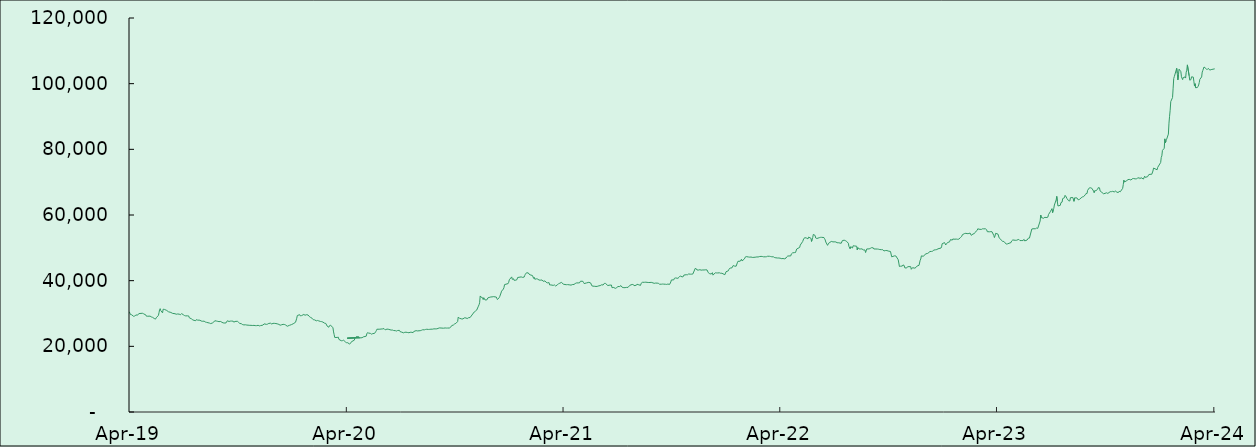
| Category | Series 0 |
|---|---|
| 2019-04-01 | 30527.5 |
| 2019-04-02 | 30226.77 |
| 2019-04-03 | 29668.73 |
| 2019-04-04 | 29553.12 |
| 2019-04-05 | 29616.38 |
| 2019-04-08 | 29162.24 |
| 2019-04-09 | 29158.736 |
| 2019-04-10 | 29193.42 |
| 2019-04-11 | 29347.62 |
| 2019-04-12 | 29560.47 |
| 2019-04-15 | 29495.91 |
| 2019-04-16 | 29746.24 |
| 2019-04-17 | 29970.86 |
| 2019-04-18 | 30086.31 |
| 2019-04-23 | 30076 |
| 2019-04-24 | 29898.31 |
| 2019-04-25 | 29919.44 |
| 2019-04-26 | 29740.41 |
| 2019-04-29 | 29521.06 |
| 2019-04-30 | 29159.74 |
| 2019-05-02 | 29171.73 |
| 2019-05-03 | 29212 |
| 2019-05-06 | 29196.87 |
| 2019-05-07 | 29096.41 |
| 2019-05-08 | 28966.41 |
| 2019-05-09 | 28896.25 |
| 2019-05-10 | 28847.81 |
| 2019-05-13 | 28484.44 |
| 2019-05-14 | 28422.76 |
| 2019-05-15 | 28286.08 |
| 2019-05-16 | 28438.19 |
| 2019-05-17 | 28871.93 |
| 2019-05-20 | 29374.47 |
| 2019-05-21 | 30218.14 |
| 2019-05-22 | 31145.15 |
| 2019-05-23 | 31477.51 |
| 2019-05-24 | 30881.29 |
| 2019-05-27 | 30194.71 |
| 2019-05-28 | 31307 |
| 2019-05-30 | 31254.19 |
| 2019-05-31 | 31069.37 |
| 2019-06-03 | 30930.39 |
| 2019-06-06 | 30527.07 |
| 2019-06-07 | 30432.13 |
| 2019-06-10 | 30322.19 |
| 2019-06-11 | 30099.83 |
| 2019-06-13 | 30029.15 |
| 2019-06-14 | 30046.7 |
| 2019-06-17 | 29936.33 |
| 2019-06-18 | 29818.8 |
| 2019-06-19 | 29772.72 |
| 2019-06-20 | 29765.31 |
| 2019-06-21 | 29851.29 |
| 2019-06-24 | 29809 |
| 2019-06-25 | 29668.68 |
| 2019-06-26 | 29609 |
| 2019-06-27 | 29749.35 |
| 2019-06-28 | 29966.87 |
| 2019-07-01 | 29614.61 |
| 2019-07-02 | 29395.14 |
| 2019-07-03 | 29375.25 |
| 2019-07-04 | 29300.09 |
| 2019-07-05 | 29270.95 |
| 2019-07-08 | 29287.87 |
| 2019-07-09 | 29318.85 |
| 2019-07-10 | 29256.6 |
| 2019-07-11 | 28712.9 |
| 2019-07-12 | 28566.79 |
| 2019-07-15 | 28341.03 |
| 2019-07-16 | 28200.88 |
| 2019-07-17 | 28042.8 |
| 2019-07-18 | 27864.49 |
| 2019-07-19 | 27919.5 |
| 2019-07-22 | 27808.69 |
| 2019-07-23 | 28144.87 |
| 2019-07-24 | 28088.74 |
| 2019-07-25 | 27990.61 |
| 2019-07-26 | 27918.59 |
| 2019-07-29 | 27950.36 |
| 2019-07-30 | 27820.57 |
| 2019-07-31 | 27718.26 |
| 2019-08-01 | 27748.46 |
| 2019-08-02 | 27630.46 |
| 2019-08-05 | 27672.29 |
| 2019-08-06 | 27527.4 |
| 2019-08-07 | 27412.13 |
| 2019-08-08 | 27424.92 |
| 2019-08-09 | 27306.81 |
| 2019-08-14 | 27083.11 |
| 2019-08-15 | 27052.93 |
| 2019-08-16 | 26925.29 |
| 2019-08-19 | 27115.89 |
| 2019-08-20 | 27058.62 |
| 2019-08-21 | 27352.94 |
| 2019-08-22 | 27629.66 |
| 2019-08-23 | 27800.17 |
| 2019-08-26 | 27691.85 |
| 2019-08-27 | 27602.77 |
| 2019-08-28 | 27607.02 |
| 2019-08-29 | 27425.57 |
| 2019-08-30 | 27525.81 |
| 2019-09-02 | 27565.09 |
| 2019-09-03 | 27586.79 |
| 2019-09-04 | 27319.64 |
| 2019-09-05 | 27273.14 |
| 2019-09-06 | 27146.57 |
| 2019-09-09 | 27089.84 |
| 2019-09-10 | 27047.58 |
| 2019-09-11 | 27153.53 |
| 2019-09-12 | 27426.64 |
| 2019-09-13 | 27779 |
| 2019-09-16 | 27574.32 |
| 2019-09-17 | 27407.04 |
| 2019-09-18 | 27681.61 |
| 2019-09-19 | 27646.15 |
| 2019-09-20 | 27698.69 |
| 2019-09-23 | 27657.27 |
| 2019-09-24 | 27352.24 |
| 2019-09-25 | 27283.05 |
| 2019-09-26 | 27579.85 |
| 2019-09-27 | 27675.04 |
| 2019-09-30 | 27630.56 |
| 2019-10-02 | 27314.87 |
| 2019-10-03 | 27085.69 |
| 2019-10-04 | 26987.45 |
| 2019-10-07 | 26866.41 |
| 2019-10-08 | 26809.92 |
| 2019-10-09 | 26598.94 |
| 2019-10-10 | 26583.75 |
| 2019-10-11 | 26533.78 |
| 2019-10-14 | 26557.44 |
| 2019-10-15 | 26513.65 |
| 2019-10-16 | 26472.2 |
| 2019-10-17 | 26456.29 |
| 2019-10-18 | 26448.62 |
| 2019-10-21 | 26390.08 |
| 2019-10-22 | 26365.83 |
| 2019-10-23 | 26397.94 |
| 2019-10-24 | 26357.24 |
| 2019-10-25 | 26348.73 |
| 2019-10-28 | 26384.45 |
| 2019-10-29 | 26244.39 |
| 2019-10-30 | 26310.77 |
| 2019-10-31 | 26355.35 |
| 2019-11-01 | 26293.3 |
| 2019-11-04 | 26401.06 |
| 2019-11-05 | 26375.35 |
| 2019-11-06 | 26223.66 |
| 2019-11-07 | 26188.24 |
| 2019-11-08 | 26314.49 |
| 2019-11-12 | 26456.39 |
| 2019-11-13 | 26339.11 |
| 2019-11-14 | 26843.11 |
| 2019-11-15 | 26851.68 |
| 2019-11-18 | 26691.09 |
| 2019-11-19 | 26739.52 |
| 2019-11-20 | 26776.15 |
| 2019-11-21 | 26872.09 |
| 2019-11-22 | 26991.42 |
| 2019-11-25 | 27035.78 |
| 2019-11-26 | 26883.33 |
| 2019-11-27 | 26790.1 |
| 2019-11-28 | 26824.5 |
| 2019-11-29 | 27002.15 |
| 2019-12-02 | 26990.59 |
| 2019-12-03 | 26944.32 |
| 2019-12-04 | 26938.58 |
| 2019-12-05 | 26913.7 |
| 2019-12-06 | 26855.52 |
| 2019-12-09 | 26681.31 |
| 2019-12-10 | 26384.21 |
| 2019-12-11 | 26434 |
| 2019-12-12 | 26569.8 |
| 2019-12-13 | 26536.21 |
| 2019-12-16 | 26695.18 |
| 2019-12-17 | 26660.44 |
| 2019-12-18 | 26665.73 |
| 2019-12-19 | 26584.45 |
| 2019-12-20 | 26526.35 |
| 2019-12-23 | 26115.8 |
| 2019-12-24 | 26090.88 |
| 2019-12-27 | 26416.48 |
| 2019-12-30 | 26609.34 |
| 2019-12-31 | 26842.07 |
| 2020-01-02 | 26867.79 |
| 2020-01-03 | 26968.79 |
| 2020-01-06 | 27339.68 |
| 2020-01-07 | 27586.93 |
| 2020-01-08 | 28562.48 |
| 2020-01-09 | 29395.57 |
| 2020-01-10 | 29415.39 |
| 2020-01-13 | 29633.58 |
| 2020-01-14 | 29283.15 |
| 2020-01-15 | 29062.5 |
| 2020-01-16 | 29352.13 |
| 2020-01-17 | 29618.52 |
| 2020-01-20 | 29710.56 |
| 2020-01-21 | 29462.76 |
| 2020-01-22 | 29458.21 |
| 2020-01-23 | 29591.29 |
| 2020-01-24 | 29628.84 |
| 2020-01-27 | 29552.99 |
| 2020-01-28 | 29378 |
| 2020-01-29 | 29110.9 |
| 2020-01-30 | 29030.93 |
| 2020-01-31 | 28843.53 |
| 2020-02-03 | 28533.4 |
| 2020-02-04 | 28432.27 |
| 2020-02-05 | 28093.76 |
| 2020-02-06 | 28140.41 |
| 2020-02-07 | 28067.09 |
| 2020-02-10 | 27772.19 |
| 2020-02-11 | 27871.9 |
| 2020-02-12 | 27878.43 |
| 2020-02-13 | 27864.84 |
| 2020-02-14 | 27755.87 |
| 2020-02-17 | 27570.58 |
| 2020-02-18 | 27547.56 |
| 2020-02-19 | 27523.08 |
| 2020-02-20 | 27568.91 |
| 2020-02-21 | 27388.62 |
| 2020-02-24 | 27041.03 |
| 2020-02-25 | 27033.1 |
| 2020-02-26 | 26974.38 |
| 2020-02-27 | 26808.24 |
| 2020-02-28 | 26216.46 |
| 2020-03-02 | 25816.57 |
| 2020-03-03 | 26255.11 |
| 2020-03-04 | 26415.54 |
| 2020-03-05 | 26449.22 |
| 2020-03-06 | 26279.61 |
| 2020-03-09 | 25650.47 |
| 2020-03-10 | 24388.66 |
| 2020-03-11 | 23572.75 |
| 2020-03-12 | 22695.88 |
| 2020-03-13 | 22734.07 |
| 2020-03-16 | 22705.19 |
| 2020-03-17 | 22543.07 |
| 2020-03-18 | 22789.64 |
| 2020-03-19 | 22118.9 |
| 2020-03-20 | 22198.43 |
| 2020-03-23 | 21700.98 |
| 2020-03-24 | 21741.16 |
| 2020-03-25 | 21729.48 |
| 2020-03-26 | 21757.47 |
| 2020-03-27 | 21861.78 |
| 2020-03-30 | 21330.79 |
| 2020-03-31 | 21300.47 |
| 2020-04-01 | 21100.54 |
| 2020-04-02 | 21121.2 |
| 2020-04-03 | 21098.57 |
| 2020-04-06 | 20669.38 |
| 2020-04-07 | 20925.19 |
| 2020-04-08 | 21073.26 |
| 2020-04-09 | 21384.03 |
| 2020-04-14 | 21879.95 |
| 2020-04-15 | 22539.94 |
| 2020-04-16 | 22554.84 |
| 2020-04-17 | 22921.59 |
| 2020-04-20 | 22920.41 |
| 2020-04-21 | 22629.92 |
| 2020-04-22 | 22780.3 |
| 2020-04-02 | 22470.79 |
| 2020-04-24 | 22599.38 |
| 2020-04-27 | 22616.28 |
| 2020-04-28 | 22727.87 |
| 2020-04-29 | 22868.4 |
| 2020-04-30 | 23021.01 |
| 2020-05-04 | 23089.86 |
| 2020-05-05 | 23809.31 |
| 2020-05-06 | 24143.37 |
| 2020-05-07 | 24354.25 |
| 2020-05-08 | 24045 |
| 2020-05-11 | 23950.83 |
| 2020-05-12 | 23695.9 |
| 2020-05-13 | 23709.44 |
| 2020-05-14 | 23892.92 |
| 2020-05-15 | 23871.33 |
| 2020-05-18 | 23941.75 |
| 2020-05-19 | 24202.87 |
| 2020-05-20 | 24452.23 |
| 2020-05-21 | 24758.39 |
| 2020-05-22 | 25204.75 |
| 2020-05-27 | 25221.29 |
| 2020-05-28 | 25166.01 |
| 2020-05-29 | 25267.82 |
| 2020-06-01 | 25316.15 |
| 2020-06-02 | 25383.43 |
| 2020-06-03 | 25407.96 |
| 2020-06-04 | 25312.05 |
| 2020-06-05 | 25020.72 |
| 2020-06-08 | 25249.9 |
| 2020-06-09 | 25335.15 |
| 2020-06-10 | 25215.04 |
| 2020-06-11 | 25182.67 |
| 2020-06-15 | 24954.25 |
| 2020-06-16 | 24930.88 |
| 2020-06-17 | 24972.82 |
| 2020-06-18 | 24933.41 |
| 2020-06-19 | 24826.75 |
| 2020-06-22 | 24779.26 |
| 2020-06-23 | 24750.06 |
| 2020-06-24 | 24654.99 |
| 2020-06-25 | 24625.17 |
| 2020-06-26 | 24828.96 |
| 2020-06-29 | 24858.89 |
| 2020-06-30 | 24479.16 |
| 2020-07-01 | 24594.99 |
| 2020-07-02 | 24374.4 |
| 2020-07-03 | 24336.12 |
| 2020-07-06 | 24109.65 |
| 2020-07-07 | 24098.08 |
| 2020-07-08 | 24278.07 |
| 2020-07-09 | 24276.56 |
| 2020-07-10 | 24306.36 |
| 2020-07-13 | 24200.6 |
| 2020-07-14 | 24117.4 |
| 2020-07-15 | 24132.3 |
| 2020-07-16 | 24330.06 |
| 2020-07-17 | 24287.66 |
| 2020-07-20 | 24273.42 |
| 2020-07-21 | 24174.45 |
| 2020-07-22 | 24173.53 |
| 2020-07-23 | 24512.27 |
| 2020-07-24 | 24427.73 |
| 2020-07-27 | 24783.61 |
| 2020-07-28 | 24650.16 |
| 2020-07-29 | 24693.73 |
| 2020-08-03 | 24766.12 |
| 2020-08-04 | 24841.94 |
| 2020-08-05 | 24882.04 |
| 2020-08-06 | 24930.34 |
| 2020-08-07 | 25041.89 |
| 2020-08-10 | 25027.61 |
| 2020-08-11 | 24883.7 |
| 2020-08-12 | 25141.48 |
| 2020-08-13 | 25236.97 |
| 2020-08-14 | 25199.84 |
| 2020-08-17 | 25143.68 |
| 2020-08-18 | 25136.49 |
| 2020-08-19 | 25171.32 |
| 2020-08-20 | 25204.6 |
| 2020-08-21 | 25221.87 |
| 2020-08-24 | 25229.12 |
| 2020-08-25 | 25291.78 |
| 2020-08-26 | 25330.1 |
| 2020-08-27 | 25304.25 |
| 2020-08-28 | 25309.37 |
| 2020-08-31 | 25327.13 |
| 2020-09-01 | 25413.76 |
| 2020-09-02 | 25460 |
| 2020-09-03 | 25511.02 |
| 2020-09-04 | 25605.64 |
| 2020-09-07 | 25582.23 |
| 2020-09-11 | 25520.97 |
| 2020-09-14 | 25605.59 |
| 2020-09-15 | 25597.96 |
| 2020-09-16 | 25558.81 |
| 2020-09-17 | 25533.35 |
| 2020-09-18 | 25572.57 |
| 2020-09-21 | 25574.35 |
| 2020-09-22 | 25654.9 |
| 2020-09-23 | 25783.02 |
| 2020-09-24 | 25987.14 |
| 2020-09-25 | 26319.47 |
| 2020-09-28 | 26507.43 |
| 2020-09-29 | 26611.96 |
| 2020-09-30 | 26837.42 |
| 2020-10-02 | 26982.5 |
| 2020-10-05 | 27554.56 |
| 2020-10-06 | 28909.37 |
| 2020-10-07 | 28634.35 |
| 2020-10-08 | 28546.22 |
| 2020-10-09 | 28415.31 |
| 2020-10-12 | 28337.49 |
| 2020-10-13 | 28344.04 |
| 2020-10-14 | 28344.33 |
| 2020-10-15 | 28344.04 |
| 2020-10-16 | 28659.45 |
| 2020-10-19 | 28659.07 |
| 2020-10-20 | 28665.82 |
| 2020-10-21 | 28449.49 |
| 2020-10-22 | 28563.87 |
| 2020-10-23 | 28697.06 |
| 2020-10-26 | 28777.96 |
| 2020-10-27 | 28980.29 |
| 2020-11-02 | 30479.39 |
| 2020-11-03 | 30733.47 |
| 2020-11-04 | 30741.88 |
| 2020-11-05 | 30738.92 |
| 2020-11-06 | 31016.17 |
| 2020-11-09 | 32243.05 |
| 2020-11-10 | 32647.1 |
| 2020-11-11 | 33268.36 |
| 2020-11-12 | 35342.46 |
| 2020-11-13 | 35037.46 |
| 2020-11-16 | 34795.82 |
| 2020-11-17 | 34242.83 |
| 2020-11-18 | 34818.01 |
| 2020-11-19 | 34643.65 |
| 2020-11-20 | 34136.82 |
| 2020-11-23 | 34119.74 |
| 2020-11-24 | 34340.56 |
| 2020-11-25 | 34769 |
| 2020-11-26 | 34803 |
| 2020-11-27 | 34885.51 |
| 2020-11-30 | 35042.14 |
| 2020-12-01 | 35147.62 |
| 2020-12-02 | 35056.82 |
| 2020-12-03 | 34968.94 |
| 2020-12-04 | 35137.99 |
| 2020-12-07 | 35064.36 |
| 2020-12-08 | 35033.74 |
| 2020-12-09 | 35021.26 |
| 2020-12-10 | 34577.26 |
| 2020-12-11 | 34250.74 |
| 2020-12-14 | 34843.44 |
| 2020-12-15 | 35225.22 |
| 2020-12-16 | 35493.15 |
| 2020-12-17 | 36239.62 |
| 2020-12-18 | 36804.75 |
| 2020-12-21 | 37443.4 |
| 2020-12-22 | 37893.61 |
| 2020-12-23 | 38803.74 |
| 2020-12-24 | 38800.01 |
| 2020-12-29 | 39110.17 |
| 2020-12-30 | 39512.31 |
| 2020-12-31 | 40270.72 |
| 2021-01-04 | 41147.39 |
| 2021-01-05 | 40396.14 |
| 2021-01-06 | 40465.15 |
| 2021-01-07 | 40590.85 |
| 2021-01-08 | 40120.22 |
| 2021-01-11 | 40150.78 |
| 2021-01-12 | 40295.95 |
| 2021-01-13 | 40341.05 |
| 2021-01-14 | 40963.14 |
| 2021-01-15 | 41176.14 |
| 2021-01-18 | 41082.38 |
| 2021-01-19 | 41051.63 |
| 2021-01-20 | 41147.72 |
| 2021-01-21 | 41099.15 |
| 2021-01-22 | 41001.99 |
| 2021-01-25 | 41088.96 |
| 2021-01-26 | 41584.94 |
| 2021-01-27 | 41930.73 |
| 2021-01-28 | 42169.41 |
| 2021-01-29 | 42412.66 |
| 2021-02-01 | 42357.9 |
| 2021-02-02 | 42043.79 |
| 2021-02-03 | 42000.01 |
| 2021-02-04 | 41785.8 |
| 2021-02-05 | 41709.09 |
| 2021-02-08 | 41564.31 |
| 2021-02-09 | 41510.16 |
| 2021-02-10 | 40696.01 |
| 2021-02-11 | 41014.3 |
| 2021-02-12 | 40439.85 |
| 2021-02-15 | 40573.31 |
| 2021-02-16 | 40494.35 |
| 2021-02-17 | 40465.32 |
| 2021-02-18 | 40212.19 |
| 2021-02-19 | 40186.7 |
| 2021-02-22 | 40154.09 |
| 2021-02-23 | 40164.86 |
| 2021-02-24 | 40221.3 |
| 2021-02-25 | 40095.49 |
| 2021-02-26 | 39799.89 |
| 2021-03-01 | 39931.63 |
| 2021-03-02 | 39697.62 |
| 2021-03-03 | 39522.06 |
| 2021-03-04 | 39364.67 |
| 2021-03-05 | 39331.61 |
| 2021-03-08 | 39396.57 |
| 2021-03-09 | 38686.85 |
| 2021-03-10 | 38931.25 |
| 2021-03-11 | 38707.87 |
| 2021-03-12 | 38648.48 |
| 2021-03-15 | 38561.84 |
| 2021-03-16 | 38720.81 |
| 2021-03-17 | 38706.13 |
| 2021-03-18 | 38914.84 |
| 2021-03-19 | 38382.39 |
| 2021-03-22 | 38722.87 |
| 2021-03-23 | 38704.97 |
| 2021-03-24 | 39085.78 |
| 2021-03-25 | 39293.14 |
| 2021-03-26 | 39216.2 |
| 2021-03-29 | 39493.37 |
| 2021-03-30 | 39267.11 |
| 2021-04-01 | 38916.74 |
| 2021-04-06 | 38766.61 |
| 2021-04-07 | 38774.03 |
| 2021-04-08 | 38799.83 |
| 2021-04-09 | 38866.39 |
| 2021-04-12 | 38712.55 |
| 2021-04-13 | 38601.83 |
| 2021-04-14 | 38636.15 |
| 2021-04-15 | 38571.89 |
| 2021-04-16 | 38808.01 |
| 2021-04-19 | 38848.02 |
| 2021-04-20 | 39015.58 |
| 2021-04-21 | 39128.34 |
| 2021-04-22 | 39131.8 |
| 2021-04-23 | 39301.82 |
| 2021-04-26 | 39318.52 |
| 2021-04-28 | 39303.09 |
| 2021-04-29 | 39461.2 |
| 2021-04-30 | 39840.28 |
| 2021-05-04 | 39801.78 |
| 2021-05-05 | 39456.64 |
| 2021-05-06 | 39114.73 |
| 2021-05-07 | 39198.75 |
| 2021-05-10 | 39312.74 |
| 2021-05-11 | 39382.96 |
| 2021-05-14 | 39494.7 |
| 2021-05-17 | 39306.47 |
| 2021-05-18 | 39022.52 |
| 2021-05-19 | 38445.09 |
| 2021-05-21 | 38324.07 |
| 2021-05-24 | 38287.58 |
| 2021-05-25 | 38256.76 |
| 2021-05-26 | 38233.68 |
| 2021-05-28 | 38256.95 |
| 2021-05-31 | 38437.88 |
| 2021-06-01 | 38414.37 |
| 2021-06-02 | 38482.52 |
| 2021-06-03 | 38551.06 |
| 2021-06-04 | 38726.1 |
| 2021-06-07 | 38688.98 |
| 2021-06-08 | 38881.7 |
| 2021-06-09 | 39170.95 |
| 2021-06-10 | 39210.1 |
| 2021-06-11 | 39157.29 |
| 2021-06-15 | 38507.33 |
| 2021-06-16 | 38564.7 |
| 2021-06-17 | 38615.11 |
| 2021-06-18 | 38648.91 |
| 2021-06-21 | 38678.48 |
| 2021-06-22 | 37847.07 |
| 2021-06-23 | 37804.46 |
| 2021-06-24 | 37954.35 |
| 2021-06-25 | 37658.26 |
| 2021-06-28 | 37658.26 |
| 2021-06-29 | 37640.75 |
| 2021-06-30 | 37907.28 |
| 2021-07-01 | 37898.59 |
| 2021-07-02 | 38212.01 |
| 2021-07-05 | 38222.01 |
| 2021-07-06 | 38418.04 |
| 2021-07-07 | 38501.31 |
| 2021-07-08 | 38470.87 |
| 2021-07-09 | 37994.19 |
| 2021-07-12 | 37857.89 |
| 2021-07-13 | 37857.24 |
| 2021-07-14 | 37872.55 |
| 2021-07-15 | 37866.9 |
| 2021-07-16 | 37947.18 |
| 2021-07-19 | 37952.65 |
| 2021-07-22 | 38585.52 |
| 2021-07-23 | 38667.9 |
| 2021-07-26 | 38849.08 |
| 2021-07-27 | 38813.36 |
| 2021-07-28 | 38791.03 |
| 2021-07-29 | 38484.82 |
| 2021-07-30 | 38547.08 |
| 2021-08-02 | 38604.72 |
| 2021-08-03 | 38917.99 |
| 2021-08-04 | 38927.83 |
| 2021-08-05 | 38801.51 |
| 2021-08-06 | 38811.11 |
| 2021-08-09 | 38567.26 |
| 2021-08-10 | 39176.62 |
| 2021-08-11 | 39448.46 |
| 2021-08-12 | 39490.06 |
| 2021-08-13 | 39533.97 |
| 2021-08-16 | 39508.41 |
| 2021-08-17 | 39550.36 |
| 2021-08-18 | 39545.67 |
| 2021-08-19 | 39670.29 |
| 2021-08-20 | 39483.08 |
| 2021-08-23 | 39434.69 |
| 2021-08-24 | 39460.68 |
| 2021-08-25 | 39450 |
| 2021-08-26 | 39477.18 |
| 2021-08-27 | 39485.65 |
| 2021-08-30 | 39326.67 |
| 2021-08-31 | 39219.61 |
| 2021-09-01 | 39184.22 |
| 2021-09-02 | 39252.19 |
| 2021-09-03 | 39261.01 |
| 2021-09-06 | 39252.98 |
| 2021-09-07 | 39251.29 |
| 2021-09-08 | 39204.52 |
| 2021-09-09 | 39201.33 |
| 2021-09-10 | 38921.78 |
| 2021-09-13 | 38915.62 |
| 2021-09-14 | 38920.5 |
| 2021-09-15 | 38968.34 |
| 2021-09-16 | 38911.31 |
| 2021-09-17 | 38943.87 |
| 2021-09-20 | 38906.42 |
| 2021-09-21 | 38873.85 |
| 2021-09-22 | 38852.69 |
| 2021-09-23 | 38874.13 |
| 2021-09-24 | 38962.28 |
| 2021-09-27 | 38864.33 |
| 2021-09-28 | 38858.99 |
| 2021-09-29 | 39592.29 |
| 2021-09-30 | 40221.17 |
| 2021-10-04 | 40243.05 |
| 2021-10-05 | 40716.66 |
| 2021-10-06 | 40765.2 |
| 2021-10-07 | 40829.15 |
| 2021-10-08 | 40868.36 |
| 2021-10-11 | 40714.22 |
| 2021-10-12 | 40897.19 |
| 2021-10-13 | 41051.19 |
| 2021-10-14 | 41129.98 |
| 2021-10-15 | 41438.15 |
| 2021-10-18 | 41144.67 |
| 2021-10-20 | 41249.71 |
| 2021-10-21 | 41704.11 |
| 2021-10-22 | 41763.26 |
| 2021-10-25 | 41814.74 |
| 2021-10-26 | 41814.94 |
| 2021-10-27 | 41789.59 |
| 2021-10-28 | 41961.14 |
| 2021-10-29 | 42038.6 |
| 2021-11-01 | 41976.79 |
| 2021-11-02 | 42013.39 |
| 2021-11-03 | 41975.45 |
| 2021-11-04 | 41943.83 |
| 2021-11-05 | 42014.5 |
| 2021-11-08 | 43246.87 |
| 2021-11-09 | 43730.55 |
| 2021-11-10 | 43707.3 |
| 2021-11-11 | 43609.06 |
| 2021-11-12 | 43253.01 |
| 2021-11-15 | 43230.34 |
| 2021-11-16 | 43455.82 |
| 2021-11-17 | 43349.9 |
| 2021-11-18 | 43285.97 |
| 2021-11-19 | 43199.27 |
| 2021-11-22 | 43266.27 |
| 2021-11-23 | 43255.14 |
| 2021-11-24 | 43245.02 |
| 2021-11-25 | 43108.77 |
| 2021-11-26 | 43308.29 |
| 2021-11-29 | 43270.94 |
| 2021-11-30 | 43248.05 |
| 2021-12-01 | 42463.16 |
| 2021-12-02 | 42247.98 |
| 2021-12-03 | 42167.91 |
| 2021-12-06 | 42008.6 |
| 2021-12-07 | 42018.92 |
| 2021-12-08 | 42435.16 |
| 2021-12-09 | 41685.22 |
| 2021-12-10 | 41882.97 |
| 2021-12-13 | 42411.12 |
| 2021-12-14 | 42317.52 |
| 2021-12-15 | 42357.36 |
| 2021-12-16 | 42270.23 |
| 2021-12-17 | 42353.31 |
| 2021-12-20 | 42394.71 |
| 2021-12-21 | 42388.57 |
| 2021-12-22 | 42244.22 |
| 2021-12-23 | 42230.48 |
| 2021-12-24 | 42262.85 |
| 2021-12-29 | 41807.1 |
| 2021-12-30 | 41813.27 |
| 2021-12-31 | 42716.44 |
| 2022-01-04 | 43026.23 |
| 2022-01-05 | 43476.75 |
| 2022-01-06 | 43607.94 |
| 2022-01-07 | 43854.42 |
| 2022-01-10 | 43897.13 |
| 2022-01-11 | 43859.3 |
| 2022-01-12 | 44608.82 |
| 2022-01-13 | 44604.74 |
| 2022-01-14 | 44454.67 |
| 2022-01-17 | 44399.66 |
| 2022-01-18 | 44655.89 |
| 2022-01-19 | 45430.14 |
| 2022-01-20 | 45890.52 |
| 2022-01-21 | 45957.35 |
| 2022-01-24 | 45928.27 |
| 2022-01-25 | 45939.51 |
| 2022-01-26 | 46529.99 |
| 2022-01-27 | 46009.23 |
| 2022-01-28 | 46205.05 |
| 2022-01-31 | 46624.67 |
| 2022-02-01 | 47111.21 |
| 2022-02-02 | 46930.66 |
| 2022-02-03 | 47329.8 |
| 2022-02-04 | 47279.92 |
| 2022-02-07 | 47203.39 |
| 2022-02-08 | 47057.24 |
| 2022-02-09 | 47157.23 |
| 2022-02-10 | 47286.34 |
| 2022-02-11 | 47202.3 |
| 2022-02-14 | 47066.77 |
| 2022-02-15 | 47064.82 |
| 2022-02-16 | 47109.25 |
| 2022-02-17 | 47102.64 |
| 2022-02-18 | 47140.48 |
| 2022-02-21 | 47233.91 |
| 2022-02-22 | 47246.9 |
| 2022-02-23 | 47207.27 |
| 2022-02-24 | 47272.04 |
| 2022-02-25 | 47328.42 |
| 2022-02-28 | 47394.53 |
| 2022-03-01 | 47482.73 |
| 2022-03-02 | 47360.79 |
| 2022-03-03 | 47296.07 |
| 2022-03-04 | 47268.61 |
| 2022-03-07 | 47262.61 |
| 2022-03-08 | 47154.35 |
| 2022-03-09 | 47287.09 |
| 2022-03-10 | 47363.98 |
| 2022-03-11 | 47437.48 |
| 2022-03-14 | 47428.67 |
| 2022-03-15 | 47340.86 |
| 2022-03-16 | 47364.46 |
| 2022-03-17 | 47353.22 |
| 2022-03-18 | 47282.67 |
| 2022-03-21 | 47251.93 |
| 2022-03-22 | 47156.56 |
| 2022-03-23 | 47016.5 |
| 2022-03-24 | 46961.62 |
| 2022-03-25 | 46964.23 |
| 2022-03-28 | 46898.23 |
| 2022-03-29 | 46843.09 |
| 2022-03-30 | 46904.48 |
| 2022-03-31 | 46965.48 |
| 2022-04-01 | 46842.86 |
| 2022-04-04 | 46687.85 |
| 2022-04-05 | 46777.37 |
| 2022-04-06 | 46766.16 |
| 2022-04-07 | 46543.51 |
| 2022-04-08 | 46631.46 |
| 2022-04-11 | 46867.95 |
| 2022-04-12 | 47205.03 |
| 2022-04-13 | 47367.31 |
| 2022-04-14 | 47510.38 |
| 2022-04-19 | 47545.86 |
| 2022-04-20 | 48138.71 |
| 2022-04-21 | 48223.86 |
| 2022-04-22 | 48459.65 |
| 2022-04-25 | 48543.36 |
| 2022-04-26 | 48568.57 |
| 2022-04-27 | 48571.75 |
| 2022-04-28 | 48837.76 |
| 2022-04-29 | 49638.94 |
| 2022-05-04 | 50126.41 |
| 2022-05-05 | 50835.95 |
| 2022-05-06 | 50937.01 |
| 2022-05-09 | 51903.44 |
| 2022-05-10 | 51805.41 |
| 2022-05-11 | 52838.45 |
| 2022-05-12 | 52917.76 |
| 2022-05-13 | 53100.21 |
| 2022-05-16 | 52944.65 |
| 2022-05-17 | 52756.62 |
| 2022-05-18 | 52721.34 |
| 2022-05-19 | 53275.49 |
| 2022-05-20 | 52979.96 |
| 2022-05-23 | 52911.51 |
| 2022-05-24 | 51949.64 |
| 2022-05-25 | 52591.41 |
| 2022-05-26 | 53151.32 |
| 2022-05-27 | 54085.3 |
| 2022-05-30 | 53772.35 |
| 2022-05-31 | 52990.28 |
| 2022-06-01 | 52974.15 |
| 2022-06-02 | 52840.21 |
| 2022-06-03 | 52908.24 |
| 2022-06-06 | 53086.86 |
| 2022-06-07 | 53270.88 |
| 2022-06-08 | 53193.98 |
| 2022-06-09 | 53170.73 |
| 2022-06-10 | 53201.38 |
| 2022-06-14 | 53114.65 |
| 2022-06-15 | 52775.4 |
| 2022-06-16 | 52411.09 |
| 2022-06-17 | 51778.08 |
| 2022-06-20 | 50756.74 |
| 2022-06-21 | 51091.75 |
| 2022-06-22 | 51377.21 |
| 2022-06-23 | 51618.73 |
| 2022-06-24 | 51705.61 |
| 2022-06-27 | 51962.85 |
| 2022-06-28 | 51803.98 |
| 2022-06-29 | 51802.48 |
| 2022-06-30 | 51817.59 |
| 2022-07-01 | 51829.67 |
| 2022-07-04 | 51791.45 |
| 2022-07-05 | 51586.5 |
| 2022-07-06 | 51556.54 |
| 2022-07-07 | 51563.73 |
| 2022-07-08 | 51557.41 |
| 2022-07-13 | 51390.25 |
| 2022-07-14 | 51339.01 |
| 2022-07-15 | 52215.12 |
| 2022-07-18 | 52319.94 |
| 2022-07-19 | 52308.88 |
| 2022-07-20 | 52186.52 |
| 2022-07-21 | 52122 |
| 2022-07-22 | 51979.92 |
| 2022-07-25 | 51400.53 |
| 2022-07-26 | 50442.37 |
| 2022-07-27 | 50188.55 |
| 2022-07-28 | 49667.14 |
| 2022-07-29 | 50370.25 |
| 2022-08-01 | 49950.32 |
| 2022-08-02 | 50626.04 |
| 2022-08-03 | 50594.97 |
| 2022-08-04 | 50582.3 |
| 2022-08-05 | 50722.33 |
| 2022-08-08 | 50489.73 |
| 2022-08-09 | 49350.71 |
| 2022-08-10 | 50075.47 |
| 2022-08-11 | 50014.6 |
| 2022-08-12 | 49664.07 |
| 2022-08-15 | 49657.33 |
| 2022-08-16 | 49709.46 |
| 2022-08-17 | 49691.17 |
| 2022-08-18 | 49546.38 |
| 2022-08-19 | 49370.62 |
| 2022-08-22 | 49346.4 |
| 2022-08-23 | 48567.14 |
| 2022-08-24 | 48675.33 |
| 2022-08-25 | 49661.87 |
| 2022-08-26 | 49682.15 |
| 2022-08-29 | 49676.75 |
| 2022-08-30 | 49642.69 |
| 2022-08-31 | 49836.51 |
| 2022-09-01 | 49889.88 |
| 2022-09-02 | 50045.83 |
| 2022-09-05 | 49991.41 |
| 2022-09-06 | 49644.92 |
| 2022-09-07 | 49599.73 |
| 2022-09-08 | 49652.25 |
| 2022-09-09 | 49695.12 |
| 2022-09-12 | 49626.05 |
| 2022-09-13 | 49627.72 |
| 2022-09-14 | 49576.05 |
| 2022-09-15 | 49540.48 |
| 2022-09-16 | 49475.42 |
| 2022-09-19 | 49440.21 |
| 2022-09-20 | 49445.31 |
| 2022-09-21 | 49421.91 |
| 2022-09-22 | 49190.34 |
| 2022-09-23 | 49053.91 |
| 2022-09-26 | 49189.32 |
| 2022-09-27 | 49161.45 |
| 2022-09-28 | 49171.7 |
| 2022-09-29 | 48964.83 |
| 2022-09-30 | 49035.07 |
| 2022-10-04 | 48879.74 |
| 2022-10-05 | 48836.7 |
| 2022-10-06 | 47260.89 |
| 2022-10-07 | 47351.43 |
| 2022-10-11 | 47565.92 |
| 2022-10-12 | 47531.84 |
| 2022-10-13 | 47524.38 |
| 2022-10-14 | 47569.04 |
| 2022-10-17 | 46365.95 |
| 2022-10-18 | 45366.32 |
| 2022-10-19 | 44318.15 |
| 2022-10-20 | 44332.21 |
| 2022-10-21 | 44396.73 |
| 2022-10-24 | 44461.63 |
| 2022-10-25 | 44788.14 |
| 2022-10-26 | 44859.78 |
| 2022-10-27 | 44625.18 |
| 2022-10-28 | 43912.64 |
| 2022-10-31 | 43839.08 |
| 2022-11-01 | 43745.73 |
| 2022-11-02 | 44283.02 |
| 2022-11-03 | 44236.7 |
| 2022-11-04 | 44269.18 |
| 2022-11-07 | 44269.43 |
| 2022-11-08 | 43461.6 |
| 2022-11-09 | 43477.48 |
| 2022-11-10 | 43942.82 |
| 2022-11-11 | 43956.76 |
| 2022-11-14 | 43818.12 |
| 2022-11-15 | 43808.25 |
| 2022-11-16 | 44046.94 |
| 2022-11-17 | 44011.22 |
| 2022-11-18 | 44492.73 |
| 2022-11-21 | 44662.96 |
| 2022-11-22 | 44934.73 |
| 2022-11-23 | 46232.37 |
| 2022-11-24 | 46604.94 |
| 2022-11-25 | 47554.34 |
| 2022-11-28 | 47436.45 |
| 2022-11-29 | 47322.97 |
| 2022-11-30 | 47660.04 |
| 2022-12-01 | 47656.64 |
| 2022-12-02 | 48154.65 |
| 2022-12-05 | 48270.23 |
| 2022-12-06 | 48366.69 |
| 2022-12-07 | 48426.49 |
| 2022-12-08 | 48365.14 |
| 2022-12-09 | 48881.93 |
| 2022-12-12 | 48899.08 |
| 2022-12-13 | 48853.54 |
| 2022-12-14 | 48988.04 |
| 2022-12-15 | 49233.02 |
| 2022-12-16 | 49316.29 |
| 2022-12-19 | 49414.96 |
| 2022-12-20 | 49416.18 |
| 2022-12-21 | 49475.43 |
| 2022-12-22 | 49499.43 |
| 2022-12-23 | 49706.09 |
| 2022-12-28 | 49934.6 |
| 2022-12-29 | 50300 |
| 2022-12-30 | 51251.06 |
| 2023-01-03 | 51598.35 |
| 2023-01-04 | 51657.56 |
| 2023-01-05 | 50868.52 |
| 2023-01-06 | 51222.34 |
| 2023-01-09 | 51693.08 |
| 2023-01-10 | 51446.6 |
| 2023-01-11 | 51729.87 |
| 2023-01-12 | 52048.85 |
| 2023-01-13 | 52512.48 |
| 2023-01-16 | 52343.41 |
| 2023-01-17 | 52701.31 |
| 2023-01-18 | 52615.51 |
| 2023-01-19 | 52626.42 |
| 2023-01-20 | 52594.68 |
| 2023-01-23 | 52657.69 |
| 2023-01-24 | 52612.55 |
| 2023-01-25 | 52599.65 |
| 2023-01-26 | 52752.96 |
| 2023-01-27 | 52649.24 |
| 2023-01-30 | 53157.83 |
| 2023-01-31 | 53238.67 |
| 2023-02-01 | 53499.68 |
| 2023-02-02 | 53998.12 |
| 2023-02-03 | 54213.09 |
| 2023-02-06 | 54367.74 |
| 2023-02-07 | 54299.76 |
| 2023-02-08 | 54427.05 |
| 2023-02-09 | 54359.9 |
| 2023-02-10 | 54327.3 |
| 2023-02-13 | 54364.67 |
| 2023-02-14 | 54496.31 |
| 2023-02-15 | 54507.66 |
| 2023-02-16 | 54520.2 |
| 2023-02-17 | 53804.46 |
| 2023-02-20 | 54224.35 |
| 2023-02-21 | 54189.31 |
| 2023-02-22 | 54315.53 |
| 2023-02-23 | 54646.38 |
| 2023-02-24 | 54949.21 |
| 2023-02-27 | 55328.42 |
| 2023-02-28 | 55806.26 |
| 2023-03-01 | 55508.61 |
| 2023-03-02 | 55670.24 |
| 2023-03-03 | 55529.21 |
| 2023-03-06 | 55605.57 |
| 2023-03-07 | 55603.94 |
| 2023-03-08 | 55801.14 |
| 2023-03-09 | 55822.14 |
| 2023-03-10 | 55794.51 |
| 2023-03-13 | 55788.37 |
| 2023-03-14 | 55722.9 |
| 2023-03-15 | 55490.2 |
| 2023-03-16 | 54915.61 |
| 2023-03-17 | 54915.39 |
| 2023-03-20 | 54888.48 |
| 2023-03-21 | 54904.68 |
| 2023-03-22 | 54936.11 |
| 2023-03-23 | 54924.08 |
| 2023-03-24 | 54892.53 |
| 2023-03-27 | 53750.77 |
| 2023-03-28 | 53124.63 |
| 2023-03-29 | 53603.8 |
| 2023-03-30 | 54413.21 |
| 2023-03-31 | 54232.34 |
| 2023-04-03 | 54184.34 |
| 2023-04-04 | 54035.39 |
| 2023-04-05 | 53018.97 |
| 2023-04-06 | 52994.13 |
| 2023-04-11 | 51952.99 |
| 2023-04-12 | 51953.41 |
| 2023-04-13 | 51944.58 |
| 2023-04-14 | 51893.94 |
| 2023-04-17 | 51127.38 |
| 2023-04-18 | 51138.92 |
| 2023-04-19 | 51209.01 |
| 2023-04-20 | 51355.74 |
| 2023-04-25 | 51606.49 |
| 2023-04-26 | 52097.62 |
| 2023-04-27 | 52235.88 |
| 2023-04-28 | 52403.51 |
| 2023-05-02 | 52299.24 |
| 2023-05-03 | 52207.77 |
| 2023-05-04 | 52290.75 |
| 2023-05-05 | 52466.52 |
| 2023-05-08 | 52579.52 |
| 2023-05-09 | 52605.78 |
| 2023-05-10 | 52209.06 |
| 2023-05-11 | 52161.24 |
| 2023-05-12 | 52214.62 |
| 2023-05-15 | 52231.29 |
| 2023-05-16 | 52419.33 |
| 2023-05-17 | 52580.86 |
| 2023-05-18 | 52109.43 |
| 2023-05-19 | 52187.93 |
| 2023-05-22 | 52369.13 |
| 2023-05-23 | 52621.19 |
| 2023-05-24 | 52927.6 |
| 2023-05-25 | 52821.64 |
| 2023-05-26 | 52973.88 |
| 2023-05-30 | 55738.35 |
| 2023-05-31 | 55769.28 |
| 2023-06-01 | 55808.25 |
| 2023-06-02 | 55822.82 |
| 2023-06-05 | 55807.09 |
| 2023-06-06 | 56038.85 |
| 2023-06-07 | 56025.56 |
| 2023-06-08 | 55956.59 |
| 2023-06-09 | 55930.97 |
| 2023-06-13 | 58163.55 |
| 2023-06-14 | 59985.1 |
| 2023-06-15 | 59195.21 |
| 2023-06-16 | 59000.96 |
| 2023-06-19 | 59016.12 |
| 2023-06-20 | 59110.02 |
| 2023-06-21 | 59323.95 |
| 2023-06-22 | 59361.55 |
| 2023-06-23 | 59206.63 |
| 2023-06-26 | 59338.76 |
| 2023-06-27 | 60108.86 |
| 2023-06-30 | 60968.27 |
| 2023-07-03 | 61949.24 |
| 2023-07-04 | 60715.04 |
| 2023-07-05 | 61523.57 |
| 2023-07-06 | 62019.88 |
| 2023-07-07 | 63040.87 |
| 2023-07-10 | 64603.69 |
| 2023-07-11 | 65669.29 |
| 2023-07-12 | 64046.93 |
| 2023-07-13 | 62748.94 |
| 2023-07-14 | 62569.73 |
| 2023-07-17 | 62943.35 |
| 2023-07-18 | 63766.72 |
| 2023-07-19 | 63757.23 |
| 2023-07-20 | 63930.72 |
| 2023-07-21 | 65003.39 |
| 2023-07-24 | 65268.28 |
| 2023-07-25 | 65988.81 |
| 2023-07-26 | 65687.16 |
| 2023-07-27 | 65482.91 |
| 2023-07-28 | 65056.39 |
| 2023-07-31 | 64337.52 |
| 2023-08-01 | 64192.2 |
| 2023-08-02 | 64267.36 |
| 2023-08-03 | 65263.06 |
| 2023-08-04 | 65198.08 |
| 2023-08-07 | 65336.8 |
| 2023-08-08 | 65309.65 |
| 2023-08-09 | 64167.39 |
| 2023-08-10 | 65204.82 |
| 2023-08-11 | 65325.37 |
| 2023-08-14 | 65210.49 |
| 2023-08-15 | 64928.98 |
| 2023-08-16 | 64625.28 |
| 2023-08-17 | 64663.78 |
| 2023-08-18 | 64721.09 |
| 2023-08-21 | 65202.41 |
| 2023-08-22 | 65488.67 |
| 2023-08-23 | 65492.92 |
| 2023-08-24 | 65401.82 |
| 2023-08-25 | 65558.91 |
| 2023-08-28 | 66151.38 |
| 2023-08-29 | 66490.34 |
| 2023-08-30 | 66439.53 |
| 2023-08-31 | 66548.99 |
| 2023-09-01 | 67527.19 |
| 2023-09-04 | 68279.14 |
| 2023-09-05 | 68334.68 |
| 2023-09-06 | 68286.28 |
| 2023-09-07 | 68082.11 |
| 2023-09-08 | 68143.34 |
| 2023-09-11 | 67296.18 |
| 2023-09-12 | 66760.2 |
| 2023-09-13 | 67414.4 |
| 2023-09-14 | 67347.73 |
| 2023-09-15 | 67395.74 |
| 2023-09-18 | 67877.17 |
| 2023-09-19 | 68359.22 |
| 2023-09-20 | 68335.72 |
| 2023-09-21 | 68271.14 |
| 2023-09-22 | 67324.59 |
| 2023-09-25 | 66882.64 |
| 2023-09-26 | 66652.17 |
| 2023-09-28 | 66448.63 |
| 2023-09-29 | 66382.14 |
| 2023-10-03 | 66770.97 |
| 2023-10-04 | 66482.28 |
| 2023-10-05 | 66570.19 |
| 2023-10-06 | 66454.57 |
| 2023-10-09 | 67101.33 |
| 2023-10-10 | 66984.62 |
| 2023-10-11 | 67100.49 |
| 2023-10-12 | 67133.19 |
| 2023-10-13 | 67200.69 |
| 2023-10-16 | 67037.93 |
| 2023-10-17 | 67326.12 |
| 2023-10-18 | 67353.23 |
| 2023-10-19 | 67098.8 |
| 2023-10-20 | 66915.41 |
| 2023-10-23 | 66876.92 |
| 2023-10-24 | 67217.77 |
| 2023-10-25 | 67206.16 |
| 2023-10-26 | 67084.95 |
| 2023-10-27 | 67136.58 |
| 2023-10-30 | 68111.71 |
| 2023-10-31 | 69236.19 |
| 2023-11-01 | 70581.76 |
| 2023-11-02 | 70042.28 |
| 2023-11-03 | 70196.77 |
| 2023-11-06 | 70479.62 |
| 2023-11-07 | 70613.6 |
| 2023-11-08 | 70773.31 |
| 2023-11-09 | 70819.58 |
| 2023-11-10 | 70854.18 |
| 2023-11-13 | 70644.85 |
| 2023-11-14 | 70876.35 |
| 2023-11-15 | 71014.34 |
| 2023-11-16 | 71025.16 |
| 2023-11-17 | 71112.99 |
| 2023-11-20 | 71008.7 |
| 2023-11-21 | 71066.55 |
| 2023-11-22 | 71004.95 |
| 2023-11-23 | 71050.87 |
| 2023-11-24 | 71228.79 |
| 2023-11-27 | 71353.89 |
| 2023-11-28 | 71041.29 |
| 2023-11-29 | 71284.56 |
| 2023-11-30 | 71365.98 |
| 2023-12-01 | 71419.87 |
| 2023-12-04 | 70946.83 |
| 2023-12-05 | 71250.17 |
| 2023-12-06 | 71808.64 |
| 2023-12-07 | 71457.92 |
| 2023-12-08 | 71541.74 |
| 2023-12-11 | 71669.91 |
| 2023-12-12 | 71907.26 |
| 2023-12-13 | 72299.79 |
| 2023-12-14 | 72458.03 |
| 2023-12-15 | 72389.23 |
| 2023-12-18 | 72404.91 |
| 2023-12-19 | 72470.1 |
| 2023-12-20 | 73397.71 |
| 2023-12-21 | 74289.02 |
| 2023-12-22 | 74023.27 |
| 2023-12-27 | 73768.64 |
| 2023-12-28 | 74502.58 |
| 2023-12-29 | 74773.77 |
| 2024-01-02 | 75990.88 |
| 2024-01-03 | 77537.57 |
| 2024-01-04 | 78020.54 |
| 2024-01-05 | 79664.66 |
| 2024-01-08 | 80324.53 |
| 2024-01-09 | 83191.84 |
| 2024-01-10 | 82024.38 |
| 2024-01-11 | 82597.04 |
| 2024-01-12 | 83042.96 |
| 2024-01-15 | 84640.89 |
| 2024-01-16 | 87970.37 |
| 2024-01-17 | 90063.27 |
| 2024-01-18 | 91896.97 |
| 2024-01-19 | 94538.12 |
| 2024-01-22 | 95768.12 |
| 2024-01-23 | 98616.97 |
| 2024-01-24 | 101571.11 |
| 2024-01-25 | 102149.93 |
| 2024-01-26 | 102401.88 |
| 2024-01-29 | 104674.67 |
| 2024-01-30 | 103110.15 |
| 2024-01-31 | 101154.13 |
| 2024-02-01 | 102802.25 |
| 2024-02-02 | 104421.23 |
| 2024-02-05 | 103659.81 |
| 2024-02-06 | 102108.05 |
| 2024-02-07 | 102106.31 |
| 2024-02-08 | 101227.42 |
| 2024-02-09 | 101858.37 |
| 2024-02-12 | 102042.32 |
| 2024-02-13 | 101707.7 |
| 2024-02-14 | 103498.28 |
| 2024-02-15 | 104100 |
| 2024-02-16 | 105722.78 |
| 2024-02-19 | 102393.23 |
| 2024-02-20 | 101060.67 |
| 2024-02-21 | 101362.38 |
| 2024-02-22 | 101239.1 |
| 2024-02-23 | 102088.07 |
| 2024-02-26 | 101995.53 |
| 2024-02-27 | 100582.89 |
| 2024-02-28 | 99266.02 |
| 2024-02-29 | 99980.3 |
| 2024-03-01 | 98751.98 |
| 2024-03-04 | 98847.89 |
| 2024-03-05 | 99192.82 |
| 2024-03-06 | 99591.64 |
| 2024-03-07 | 100335.3 |
| 2024-03-08 | 101330.85 |
| 2024-03-11 | 102044.84 |
| 2024-03-12 | 103524.44 |
| 2024-03-13 | 104007.36 |
| 2024-03-14 | 104056.21 |
| 2024-03-15 | 105085.25 |
| 2024-03-18 | 104663.3 |
| 2024-03-19 | 104553.31 |
| 2024-03-20 | 104256.81 |
| 2024-03-21 | 104387.47 |
| 2024-03-22 | 104647.37 |
| 2024-03-25 | 104136.35 |
| 2024-03-26 | 103952.47 |
| 2024-03-27 | 104283.64 |
| 2024-03-28 | 104562.06 |
| 2024-04-02 | 104518.14 |